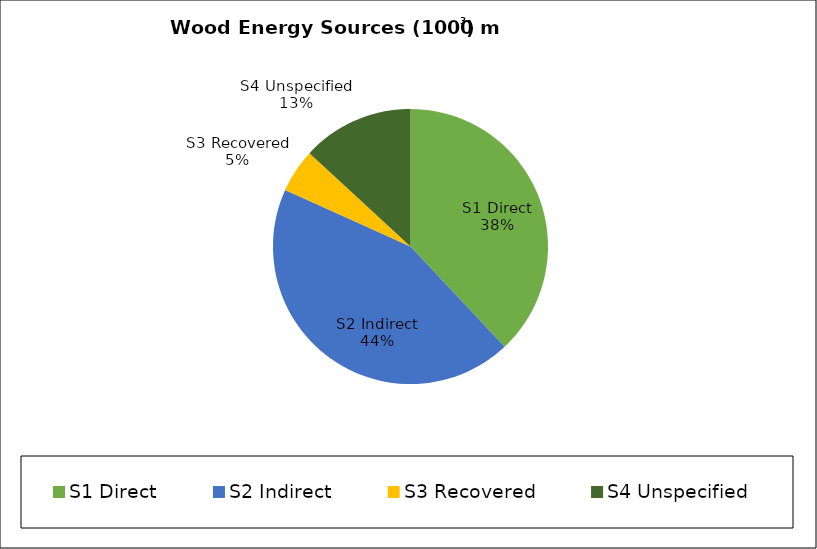
| Category | Series 0 |
|---|---|
| S1 Direct | 0.38 |
| S2 Indirect | 0.438 |
| S3 Recovered | 0.051 |
| S4 Unspecified | 0.131 |